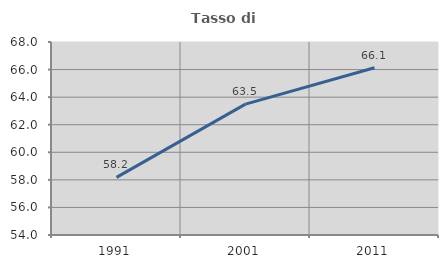
| Category | Tasso di occupazione   |
|---|---|
| 1991.0 | 58.177 |
| 2001.0 | 63.495 |
| 2011.0 | 66.132 |